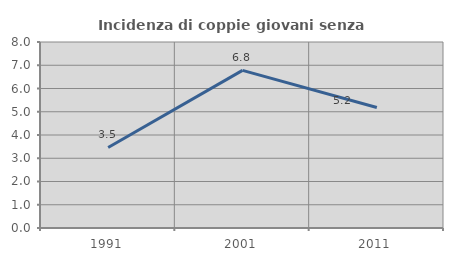
| Category | Incidenza di coppie giovani senza figli |
|---|---|
| 1991.0 | 3.463 |
| 2001.0 | 6.78 |
| 2011.0 | 5.185 |